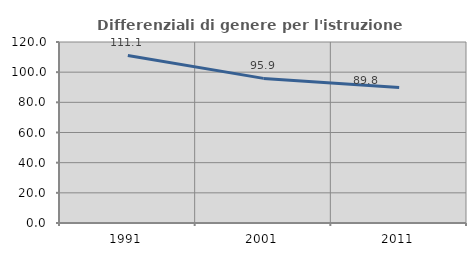
| Category | Differenziali di genere per l'istruzione superiore |
|---|---|
| 1991.0 | 111.088 |
| 2001.0 | 95.88 |
| 2011.0 | 89.833 |